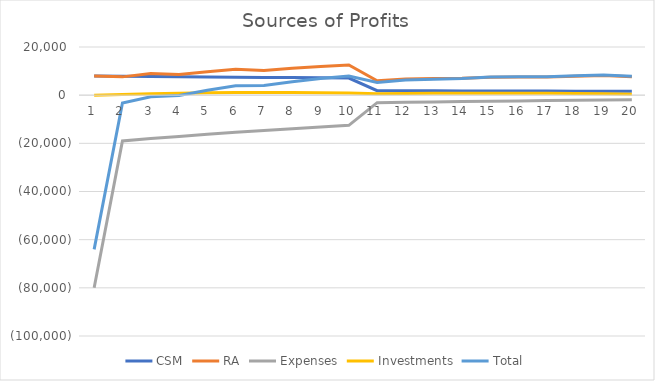
| Category | CSM | RA | Expenses | Investments | Total |
|---|---|---|---|---|---|
| 0 | 7967.195 | 8000 | -80000 | 5 | -64027.805 |
| 1 | 7868.275 | 7596.8 | -18992 | 300.037 | -3226.888 |
| 2 | 7770.582 | 9017.402 | -18034.803 | 590.503 | -656.317 |
| 3 | 7673.295 | 8562.023 | -17124.046 | 777.779 | -110.95 |
| 4 | 7577.225 | 9755.569 | -16259.281 | 962.806 | 2036.318 |
| 5 | 7481.57 | 10805.593 | -15436.562 | 1056.498 | 3907.1 |
| 6 | 7386.345 | 10257.75 | -14653.928 | 1064.732 | 4054.898 |
| 7 | 7292.331 | 11128.779 | -13910.974 | 1073.599 | 5583.735 |
| 8 | 7198.756 | 11883.867 | -13204.296 | 1006.55 | 6884.877 |
| 9 | 7105.633 | 12532.198 | -12532.198 | 868.335 | 7973.968 |
| 10 | 1840.075 | 6006.996 | -3120.517 | 577.125 | 5303.678 |
| 11 | 1814.31 | 6730.552 | -2958.484 | 704.476 | 6290.854 |
| 12 | 1788.246 | 6869.383 | -2803.83 | 774.045 | 6627.843 |
| 13 | 1762.23 | 6974.018 | -2656.769 | 816.824 | 6896.303 |
| 14 | 1736.273 | 7487.945 | -2516.956 | 834.711 | 7541.972 |
| 15 | 1710.065 | 7508.405 | -2383.621 | 805.167 | 7640.016 |
| 16 | 1683.942 | 7504.296 | -2256.931 | 754.438 | 7685.745 |
| 17 | 1657.912 | 7851.932 | -2136.58 | 683.978 | 8057.242 |
| 18 | 1631.68 | 8138.145 | -2021.899 | 574.501 | 8322.427 |
| 19 | 1605.27 | 7698.481 | -1912.666 | 428.642 | 7819.727 |